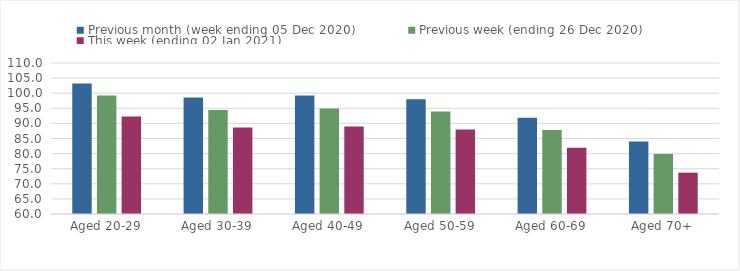
| Category | Previous month (week ending 05 Dec 2020) | Previous week (ending 26 Dec 2020) | This week (ending 02 Jan 2021) |
|---|---|---|---|
| Aged 20-29 | 103.18 | 99.2 | 92.27 |
| Aged 30-39 | 98.59 | 94.45 | 88.67 |
| Aged 40-49 | 99.21 | 94.9 | 89.01 |
| Aged 50-59 | 98.03 | 93.91 | 88.02 |
| Aged 60-69 | 91.89 | 87.79 | 81.97 |
| Aged 70+ | 84.04 | 79.86 | 73.69 |